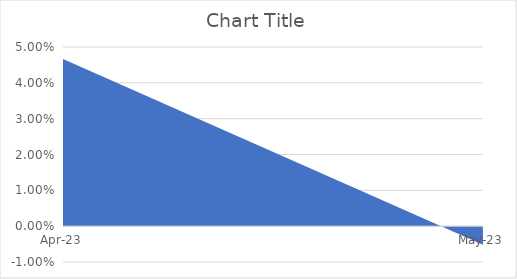
| Category | Series 0 |
|---|---|
| 2023-04-08 | 0.047 |
| 2023-05-08 | -0.005 |